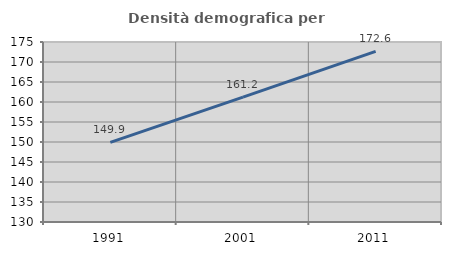
| Category | Densità demografica |
|---|---|
| 1991.0 | 149.907 |
| 2001.0 | 161.211 |
| 2011.0 | 172.638 |